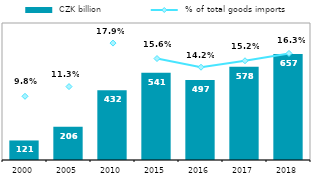
| Category |  CZK billion |
|---|---|
| 2000.0 | 121.259 |
| 2005.0 | 205.937 |
| 2010.0 | 432.179 |
| 2015.0 | 540.741 |
| 2016.0 | 496.943 |
| 2017.0 | 578.294 |
| 2018.0 | 657.087 |